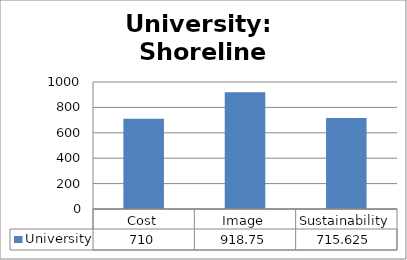
| Category | University |
|---|---|
| Cost | 710 |
| Image | 918.75 |
| Sustainability | 715.625 |